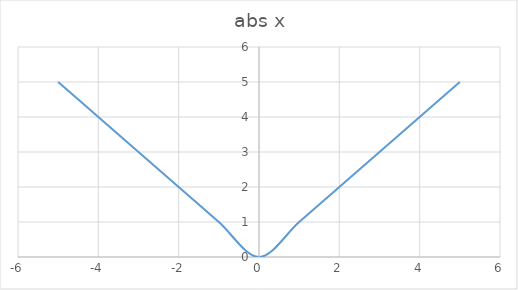
| Category | y |
|---|---|
| -5.0 | 5 |
| -4.0 | 4 |
| -3.0 | 3 |
| -2.0 | 2 |
| -1.0 | 1 |
| 0.0 | 0 |
| 1.0 | 1 |
| 2.0 | 2 |
| 3.0 | 3 |
| 4.0 | 4 |
| 5.0 | 5 |